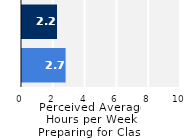
| Category | Series 0 |
|---|---|
| Upper Division | 2.742 |
| Lower Division | 2.202 |